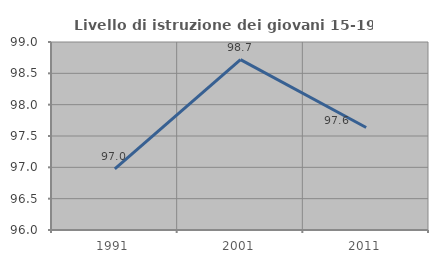
| Category | Livello di istruzione dei giovani 15-19 anni |
|---|---|
| 1991.0 | 96.977 |
| 2001.0 | 98.718 |
| 2011.0 | 97.635 |